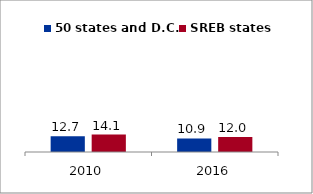
| Category | 50 states and D.C. | SREB states |
|---|---|---|
| 2010.0 | 12.745 | 14.092 |
| 2016.0 | 10.917 | 12 |